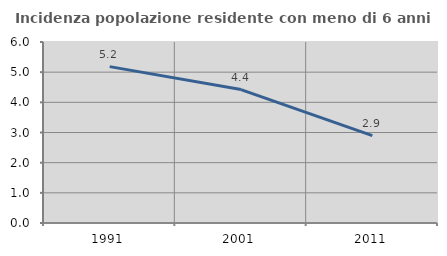
| Category | Incidenza popolazione residente con meno di 6 anni |
|---|---|
| 1991.0 | 5.183 |
| 2001.0 | 4.422 |
| 2011.0 | 2.896 |